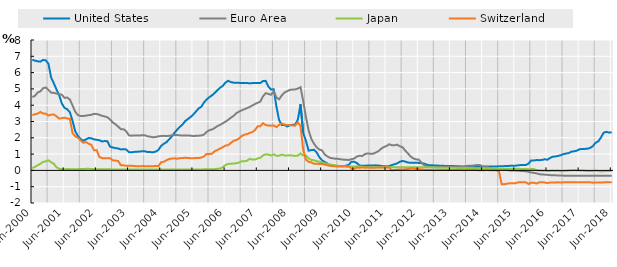
| Category | United States | Euro Area | Japan | Switzerland |
|---|---|---|---|---|
| 1999-12-15 | 6.127 | 3.45 | 0.315 | 1.847 |
| 2000-01-15 | 6.039 | 3.34 | 0.145 | 2.132 |
| 2000-02-15 | 6.1 | 3.54 | 0.127 | 2.442 |
| 2000-03-15 | 6.197 | 3.75 | 0.141 | 2.855 |
| 2000-04-15 | 6.312 | 3.93 | 0.118 | 3.243 |
| 2000-05-15 | 6.756 | 4.36 | 0.103 | 3.16 |
| 2000-06-15 | 6.79 | 4.5 | 0.128 | 3.397 |
| 2000-07-15 | 6.732 | 4.58 | 0.224 | 3.44 |
| 2000-08-15 | 6.691 | 4.78 | 0.313 | 3.487 |
| 2000-09-15 | 6.674 | 4.85 | 0.408 | 3.585 |
| 2000-10-15 | 6.778 | 5.04 | 0.522 | 3.492 |
| 2000-11-15 | 6.752 | 5.09 | 0.553 | 3.478 |
| 2000-12-15 | 6.545 | 4.94 | 0.617 | 3.37 |
| 2001-01-15 | 5.698 | 4.77 | 0.499 | 3.42 |
| 2001-02-15 | 5.348 | 4.76 | 0.408 | 3.428 |
| 2001-03-15 | 4.964 | 4.71 | 0.194 | 3.325 |
| 2001-04-15 | 4.614 | 4.68 | 0.1 | 3.175 |
| 2001-05-15 | 4.104 | 4.64 | 0.075 | 3.205 |
| 2001-06-15 | 3.834 | 4.45 | 0.069 | 3.237 |
| 2001-07-15 | 3.751 | 4.47 | 0.08 | 3.19 |
| 2001-08-15 | 3.566 | 4.35 | 0.076 | 3.157 |
| 2001-09-15 | 3.035 | 3.98 | 0.064 | 2.283 |
| 2001-10-15 | 2.4 | 3.6 | 0.078 | 2.09 |
| 2001-11-15 | 2.103 | 3.39 | 0.078 | 2.003 |
| 2001-12-15 | 1.924 | 3.34 | 0.084 | 1.837 |
| 2002-01-15 | 1.821 | 3.34 | 0.088 | 1.697 |
| 2002-02-15 | 1.903 | 3.36 | 0.095 | 1.738 |
| 2002-03-15 | 1.988 | 3.39 | 0.103 | 1.635 |
| 2002-04-15 | 1.967 | 3.41 | 0.081 | 1.57 |
| 2002-05-15 | 1.904 | 3.47 | 0.077 | 1.232 |
| 2002-06-15 | 1.878 | 3.46 | 0.07 | 1.243 |
| 2002-07-15 | 1.848 | 3.41 | 0.071 | 0.822 |
| 2002-08-15 | 1.775 | 3.35 | 0.066 | 0.752 |
| 2002-09-15 | 1.805 | 3.31 | 0.065 | 0.748 |
| 2002-10-15 | 1.784 | 3.26 | 0.071 | 0.743 |
| 2002-11-15 | 1.456 | 3.12 | 0.071 | 0.745 |
| 2002-12-15 | 1.407 | 2.94 | 0.061 | 0.617 |
| 2003-01-15 | 1.366 | 2.83 | 0.062 | 0.603 |
| 2003-02-15 | 1.343 | 2.69 | 0.059 | 0.572 |
| 2003-03-15 | 1.286 | 2.53 | 0.056 | 0.313 |
| 2003-04-15 | 1.3 | 2.53 | 0.06 | 0.308 |
| 2003-05-15 | 1.284 | 2.4 | 0.059 | 0.282 |
| 2003-06-15 | 1.122 | 2.15 | 0.058 | 0.288 |
| 2003-07-15 | 1.11 | 2.13 | 0.05 | 0.287 |
| 2003-08-15 | 1.135 | 2.14 | 0.053 | 0.267 |
| 2003-09-15 | 1.142 | 2.15 | 0.054 | 0.254 |
| 2003-10-15 | 1.158 | 2.14 | 0.057 | 0.249 |
| 2003-11-15 | 1.172 | 2.16 | 0.056 | 0.267 |
| 2003-12-15 | 1.17 | 2.15 | 0.057 | 0.26 |
| 2004-01-15 | 1.128 | 2.09 | 0.057 | 0.247 |
| 2004-02-15 | 1.124 | 2.07 | 0.052 | 0.258 |
| 2004-03-15 | 1.112 | 2.03 | 0.052 | 0.25 |
| 2004-04-15 | 1.152 | 2.05 | 0.048 | 0.272 |
| 2004-05-15 | 1.253 | 2.09 | 0.048 | 0.26 |
| 2004-06-15 | 1.501 | 2.11 | 0.05 | 0.498 |
| 2004-07-15 | 1.628 | 2.12 | 0.052 | 0.53 |
| 2004-08-15 | 1.729 | 2.11 | 0.051 | 0.62 |
| 2004-09-15 | 1.904 | 2.12 | 0.052 | 0.7 |
| 2004-10-15 | 2.082 | 2.15 | 0.053 | 0.727 |
| 2004-11-15 | 2.306 | 2.17 | 0.052 | 0.74 |
| 2004-12-15 | 2.499 | 2.17 | 0.052 | 0.717 |
| 2005-01-15 | 2.667 | 2.15 | 0.053 | 0.75 |
| 2005-02-15 | 2.82 | 2.14 | 0.052 | 0.758 |
| 2005-03-15 | 3.024 | 2.14 | 0.053 | 0.775 |
| 2005-04-15 | 3.153 | 2.14 | 0.053 | 0.76 |
| 2005-05-15 | 3.274 | 2.13 | 0.054 | 0.75 |
| 2005-06-15 | 3.426 | 2.11 | 0.054 | 0.748 |
| 2005-07-15 | 3.613 | 2.12 | 0.056 | 0.755 |
| 2005-08-15 | 3.799 | 2.13 | 0.056 | 0.76 |
| 2005-09-15 | 3.906 | 2.14 | 0.058 | 0.79 |
| 2005-10-15 | 4.167 | 2.2 | 0.064 | 0.85 |
| 2005-11-15 | 4.352 | 2.36 | 0.065 | 1.01 |
| 2005-12-15 | 4.491 | 2.47 | 0.066 | 1.01 |
| 2006-01-15 | 4.605 | 2.51 | 0.067 | 1.024 |
| 2006-02-15 | 4.756 | 2.6 | 0.075 | 1.176 |
| 2006-03-15 | 4.92 | 2.72 | 0.104 | 1.249 |
| 2006-04-15 | 5.071 | 2.79 | 0.112 | 1.34 |
| 2006-05-15 | 5.186 | 2.89 | 0.189 | 1.423 |
| 2006-06-15 | 5.385 | 2.99 | 0.325 | 1.52 |
| 2006-07-15 | 5.495 | 3.1 | 0.396 | 1.55 |
| 2006-08-15 | 5.421 | 3.23 | 0.412 | 1.68 |
| 2006-09-15 | 5.384 | 3.34 | 0.418 | 1.811 |
| 2006-10-15 | 5.373 | 3.5 | 0.438 | 1.86 |
| 2006-11-15 | 5.372 | 3.6 | 0.479 | 1.95 |
| 2006-12-15 | 5.36 | 3.68 | 0.555 | 2.102 |
| 2007-01-15 | 5.36 | 3.75 | 0.562 | 2.19 |
| 2007-02-15 | 5.359 | 3.82 | 0.589 | 2.22 |
| 2007-03-15 | 5.347 | 3.89 | 0.707 | 2.295 |
| 2007-04-15 | 5.355 | 3.98 | 0.664 | 2.35 |
| 2007-05-15 | 5.359 | 4.07 | 0.671 | 2.47 |
| 2007-06-15 | 5.36 | 4.15 | 0.734 | 2.7 |
| 2007-07-15 | 5.36 | 4.22 | 0.773 | 2.708 |
| 2007-08-15 | 5.483 | 4.54 | 0.918 | 2.897 |
| 2007-09-15 | 5.494 | 4.74 | 0.986 | 2.785 |
| 2007-10-15 | 5.146 | 4.69 | 0.971 | 2.753 |
| 2007-11-15 | 4.962 | 4.64 | 0.911 | 2.745 |
| 2007-12-15 | 4.979 | 4.85 | 0.99 | 2.757 |
| 2008-01-15 | 3.918 | 4.48 | 0.894 | 2.653 |
| 2008-02-15 | 3.088 | 4.36 | 0.896 | 2.797 |
| 2008-03-15 | 2.782 | 4.6 | 0.966 | 2.885 |
| 2008-04-15 | 2.795 | 4.78 | 0.921 | 2.808 |
| 2008-05-15 | 2.692 | 4.86 | 0.916 | 2.778 |
| 2008-06-15 | 2.765 | 4.94 | 0.924 | 2.79 |
| 2008-07-15 | 2.792 | 4.96 | 0.916 | 2.756 |
| 2008-08-15 | 2.806 | 4.97 | 0.887 | 2.745 |
| 2008-09-15 | 3.122 | 5.02 | 0.907 | 2.955 |
| 2008-10-15 | 4.059 | 5.11 | 1.038 | 2.718 |
| 2008-11-15 | 2.279 | 4.24 | 0.909 | 1.255 |
| 2008-12-15 | 1.829 | 3.29 | 0.922 | 0.662 |
| 2009-01-15 | 1.211 | 2.46 | 0.734 | 0.527 |
| 2009-02-15 | 1.243 | 1.94 | 0.644 | 0.495 |
| 2009-03-15 | 1.267 | 1.64 | 0.62 | 0.403 |
| 2009-04-15 | 1.106 | 1.42 | 0.567 | 0.403 |
| 2009-05-15 | 0.815 | 1.28 | 0.533 | 0.398 |
| 2009-06-15 | 0.621 | 1.23 | 0.489 | 0.395 |
| 2009-07-15 | 0.515 | 0.98 | 0.431 | 0.36 |
| 2009-08-15 | 0.424 | 0.86 | 0.399 | 0.317 |
| 2009-09-15 | 0.298 | 0.77 | 0.361 | 0.288 |
| 2009-10-15 | 0.283 | 0.74 | 0.335 | 0.262 |
| 2009-11-15 | 0.268 | 0.72 | 0.31 | 0.25 |
| 2009-12-15 | 0.253 | 0.71 | 0.28 | 0.252 |
| 2010-01-15 | 0.249 | 0.68 | 0.26 | 0.25 |
| 2010-02-15 | 0.252 | 0.66 | 0.254 | 0.25 |
| 2010-03-15 | 0.292 | 0.65 | 0.246 | 0.247 |
| 2010-04-15 | 0.347 | 0.64 | 0.238 | 0.246 |
| 2010-05-15 | 0.536 | 0.69 | 0.244 | 0.108 |
| 2010-06-15 | 0.534 | 0.73 | 0.244 | 0.112 |
| 2010-07-15 | 0.454 | 0.85 | 0.244 | 0.172 |
| 2010-08-15 | 0.296 | 0.9 | 0.239 | 0.165 |
| 2010-09-15 | 0.29 | 0.88 | 0.225 | 0.178 |
| 2010-10-15 | 0.286 | 1 | 0.202 | 0.168 |
| 2010-11-15 | 0.3 | 1.04 | 0.194 | 0.172 |
| 2010-12-15 | 0.303 | 1.02 | 0.185 | 0.17 |
| 2011-01-15 | 0.304 | 1.02 | 0.188 | 0.17 |
| 2011-02-15 | 0.31 | 1.09 | 0.19 | 0.17 |
| 2011-03-15 | 0.303 | 1.18 | 0.196 | 0.18 |
| 2011-04-15 | 0.273 | 1.32 | 0.198 | 0.185 |
| 2011-05-15 | 0.253 | 1.43 | 0.196 | 0.176 |
| 2011-06-15 | 0.246 | 1.49 | 0.195 | 0.175 |
| 2011-07-15 | 0.256 | 1.6 | 0.195 | 0.175 |
| 2011-08-15 | 0.327 | 1.55 | 0.193 | 0.005 |
| 2011-09-15 | 0.374 | 1.54 | 0.193 | 0.023 |
| 2011-10-15 | 0.429 | 1.58 | 0.195 | 0.043 |
| 2011-11-15 | 0.529 | 1.48 | 0.196 | 0.052 |
| 2011-12-15 | 0.581 | 1.43 | 0.196 | 0.052 |
| 2012-01-15 | 0.542 | 1.22 | 0.196 | 0.07 |
| 2012-02-15 | 0.484 | 1.05 | 0.196 | 0.087 |
| 2012-03-15 | 0.468 | 0.86 | 0.196 | 0.11 |
| 2012-04-15 | 0.466 | 0.74 | 0.196 | 0.112 |
| 2012-05-15 | 0.467 | 0.68 | 0.196 | 0.098 |
| 2012-06-15 | 0.461 | 0.66 | 0.196 | 0.087 |
| 2012-07-15 | 0.443 | 0.5 | 0.196 | 0.06 |
| 2012-08-15 | 0.418 | 0.33 | 0.194 | 0.046 |
| 2012-09-15 | 0.358 | 0.25 | 0.193 | 0.044 |
| 2012-10-15 | 0.313 | 0.21 | 0.189 | 0.032 |
| 2012-11-15 | 0.31 | 0.19 | 0.188 | 0.03 |
| 2012-12-15 | 0.306 | 0.19 | 0.181 | 0.012 |
| 2013-01-15 | 0.298 | 0.2 | 0.17 | 0.022 |
| 2013-02-15 | 0.287 | 0.22 | 0.163 | 0.022 |
| 2013-03-15 | 0.283 | 0.21 | 0.16 | 0.022 |
| 2013-04-15 | 0.273 | 0.21 | 0.156 | 0.02 |
| 2013-05-15 | 0.275 | 0.2 | 0.155 | 0.016 |
| 2013-06-15 | 0.273 | 0.21 | 0.155 | 0.019 |
| 2013-07-15 | 0.266 | 0.22 | 0.157 | 0.018 |
| 2013-08-15 | 0.26 | 0.23 | 0.154 | 0.018 |
| 2013-09-15 | 0.249 | 0.22 | 0.153 | 0.022 |
| 2013-10-15 | 0.242 | 0.23 | 0.145 | 0.019 |
| 2013-11-15 | 0.239 | 0.22 | 0.143 | 0.015 |
| 2013-12-15 | 0.246 | 0.27 | 0.146 | 0.023 |
| 2014-01-15 | 0.237 | 0.29 | 0.144 | 0.018 |
| 2014-02-15 | 0.236 | 0.29 | 0.139 | 0.022 |
| 2014-03-15 | 0.231 | 0.31 | 0.138 | 0.022 |
| 2014-04-15 | 0.223 | 0.33 | 0.136 | 0.017 |
| 2014-05-15 | 0.227 | 0.32 | 0.135 | 0.012 |
| 2014-06-15 | 0.231 | 0.24 | 0.134 | 0.008 |
| 2014-07-15 | 0.239 | 0.21 | 0.132 | 0.018 |
| 2014-08-15 | 0.234 | 0.19 | 0.129 | 0.018 |
| 2014-09-15 | 0.235 | 0.1 | 0.122 | 0.006 |
| 2014-10-15 | 0.232 | 0.08 | 0.112 | 0.015 |
| 2014-11-15 | 0.234 | 0.08 | 0.106 | 0.001 |
| 2014-12-15 | 0.256 | 0.08 | 0.11 | -0.063 |
| 2015-01-15 | 0.253 | 0.06 | 0.103 | -0.854 |
| 2015-02-15 | 0.262 | 0.05 | 0.102 | -0.85 |
| 2015-03-15 | 0.271 | 0.03 | 0.097 | -0.814 |
| 2015-04-15 | 0.279 | 0 | 0.095 | -0.794 |
| 2015-05-15 | 0.284 | -0.01 | 0.1 | -0.788 |
| 2015-06-15 | 0.283 | -0.01 | 0.097 | -0.789 |
| 2015-07-15 | 0.309 | -0.02 | 0.098 | -0.739 |
| 2015-08-15 | 0.329 | -0.03 | 0.093 | -0.724 |
| 2015-09-15 | 0.325 | -0.04 | 0.084 | -0.733 |
| 2015-10-15 | 0.334 | -0.05 | 0.081 | -0.732 |
| 2015-11-15 | 0.416 | -0.09 | 0.076 | -0.832 |
| 2015-12-15 | 0.613 | -0.13 | 0.079 | -0.756 |
| 2016-01-15 | 0.613 | -0.15 | 0.08 | -0.757 |
| 2016-02-15 | 0.633 | -0.18 | 0.014 | -0.805 |
| 2016-03-15 | 0.629 | -0.23 | -0.006 | -0.729 |
| 2016-04-15 | 0.637 | -0.25 | -0.019 | -0.729 |
| 2016-05-15 | 0.686 | -0.26 | -0.025 | -0.735 |
| 2016-06-15 | 0.654 | -0.27 | -0.032 | -0.78 |
| 2016-07-15 | 0.759 | -0.29 | -0.032 | -0.748 |
| 2016-08-15 | 0.839 | -0.3 | -0.022 | -0.736 |
| 2016-09-15 | 0.854 | -0.3 | -0.031 | -0.75 |
| 2016-10-15 | 0.884 | -0.31 | -0.016 | -0.73 |
| 2016-11-15 | 0.934 | -0.31 | -0.058 | -0.749 |
| 2016-12-15 | 0.998 | -0.32 | -0.039 | -0.729 |
| 2017-01-15 | 1.035 | -0.33 | -0.023 | -0.729 |
| 2017-02-15 | 1.064 | -0.33 | -0.008 | -0.726 |
| 2017-03-15 | 1.15 | -0.33 | 0.001 | -0.73 |
| 2017-04-15 | 1.172 | -0.33 | 0.015 | -0.73 |
| 2017-05-15 | 1.21 | -0.33 | -0.007 | -0.73 |
| 2017-06-15 | 1.299 | -0.33 | -0.006 | -0.73 |
| 2017-07-15 | 1.311 | -0.33 | -0.008 | -0.726 |
| 2017-08-15 | 1.318 | -0.33 | -0.026 | -0.726 |
| 2017-09-15 | 1.334 | -0.33 | -0.033 | -0.726 |
| 2017-10-15 | 1.381 | -0.33 | -0.041 | -0.727 |
| 2017-11-15 | 1.487 | -0.33 | -0.035 | -0.752 |
| 2017-12-15 | 1.694 | -0.33 | -0.022 | -0.746 |
| 2018-01-15 | 1.778 | -0.33 | -0.032 | -0.745 |
| 2018-02-15 | 2.017 | -0.33 | -0.062 | -0.745 |
| 2018-03-15 | 2.312 | -0.33 | -0.05 | -0.735 |
| 2018-04-15 | 2.363 | -0.33 | -0.036 | -0.728 |
| 2018-05-15 | 2.321 | -0.33 | -0.028 | -0.735 |
| 2018-06-15 | 2.336 | -0.32 | -0.037 | -0.732 |